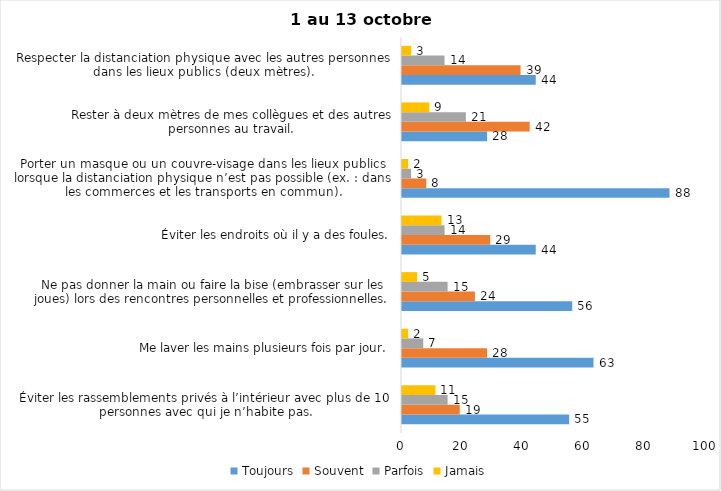
| Category | Toujours | Souvent | Parfois | Jamais |
|---|---|---|---|---|
| Éviter les rassemblements privés à l’intérieur avec plus de 10 personnes avec qui je n’habite pas. | 55 | 19 | 15 | 11 |
| Me laver les mains plusieurs fois par jour. | 63 | 28 | 7 | 2 |
| Ne pas donner la main ou faire la bise (embrasser sur les joues) lors des rencontres personnelles et professionnelles. | 56 | 24 | 15 | 5 |
| Éviter les endroits où il y a des foules. | 44 | 29 | 14 | 13 |
| Porter un masque ou un couvre-visage dans les lieux publics lorsque la distanciation physique n’est pas possible (ex. : dans les commerces et les transports en commun). | 88 | 8 | 3 | 2 |
| Rester à deux mètres de mes collègues et des autres personnes au travail. | 28 | 42 | 21 | 9 |
| Respecter la distanciation physique avec les autres personnes dans les lieux publics (deux mètres). | 44 | 39 | 14 | 3 |